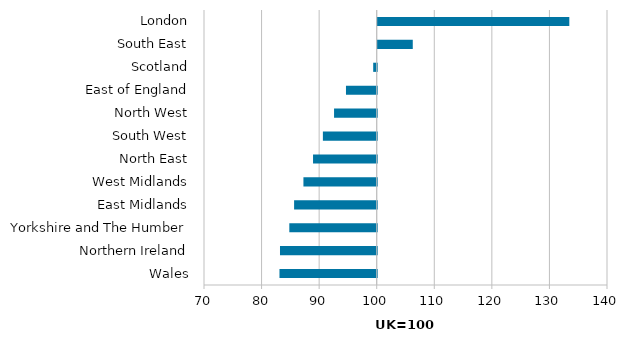
| Category | Series 0 |
|---|---|
| London | 133.28 |
| South East | 106.09 |
| Scotland | 99.39 |
| East of England | 94.66 |
| North West | 92.59 |
| South West | 90.65 |
| North East | 88.94 |
| West Midlands | 87.27 |
| East Midlands | 85.65 |
| Yorkshire and The Humber | 84.82 |
| Northern Ireland | 83.2 |
| Wales | 83.11 |